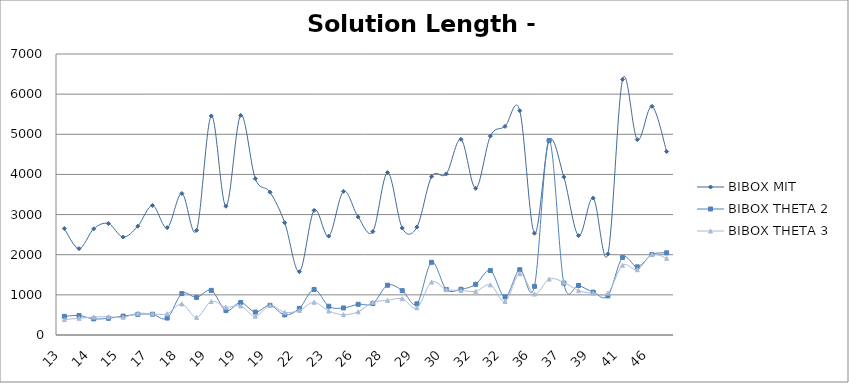
| Category | BIBOX MIT | BIBOX THETA 2 | BIBOX THETA 3 |
|---|---|---|---|
| 13.0 | 2652 | 464 | 384 |
| 14.0 | 2150 | 484 | 416 |
| 14.0 | 2645 | 401 | 447 |
| 14.0 | 2776 | 416 | 454 |
| 15.0 | 2440 | 470 | 442 |
| 15.0 | 2710 | 514 | 540 |
| 17.0 | 3226 | 516 | 528 |
| 17.0 | 2674 | 422 | 528 |
| 18.0 | 3526 | 1032 | 774 |
| 19.0 | 2609 | 937 | 439 |
| 19.0 | 5456 | 1112 | 834 |
| 19.0 | 3208 | 608 | 692 |
| 19.0 | 5471 | 809 | 725 |
| 19.0 | 3895 | 571 | 469 |
| 19.0 | 3558 | 740 | 736 |
| 20.0 | 2797 | 501 | 565 |
| 22.0 | 1577 | 663 | 613 |
| 23.0 | 3104 | 1134 | 816 |
| 23.0 | 2462 | 716 | 598 |
| 24.0 | 3578 | 674 | 508 |
| 26.0 | 2939 | 765 | 577 |
| 27.0 | 2577 | 785 | 815 |
| 28.0 | 4046 | 1240 | 862 |
| 29.0 | 2666 | 1104 | 904 |
| 29.0 | 2687 | 777 | 677 |
| 30.0 | 3945 | 1811 | 1319 |
| 30.0 | 4012 | 1134 | 1134 |
| 31.0 | 4875 | 1139 | 1113 |
| 32.0 | 3654 | 1262 | 1088 |
| 32.0 | 4955 | 1605 | 1249 |
| 32.0 | 5197 | 949 | 835 |
| 34.0 | 5587 | 1627 | 1529 |
| 36.0 | 2534 | 1212 | 1020 |
| 37.0 | 4844 | 4844 | 1392 |
| 37.0 | 3936 | 1292 | 1312 |
| 37.0 | 2474 | 1234 | 1106 |
| 39.0 | 3412 | 1068 | 1042 |
| 39.0 | 2019 | 975 | 1045 |
| 41.0 | 6365 | 1933 | 1737 |
| 45.0 | 4868 | 1698 | 1626 |
| 46.0 | 5696 | 2006 | 2004 |
| 48.0 | 4571 | 2047 | 1909 |